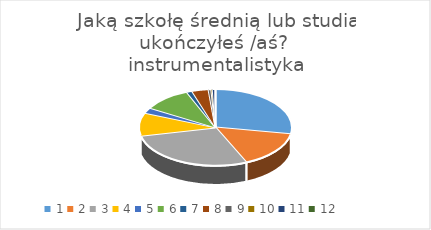
| Category | Series 0 |
|---|---|
| 0 | 95 |
| 1 | 53 |
| 2 | 96 |
| 3 | 33 |
| 4 | 8 |
| 5 | 35 |
| 6 | 4 |
| 7 | 12 |
| 8 | 2 |
| 9 | 1 |
| 10 | 2 |
| 11 | 0 |